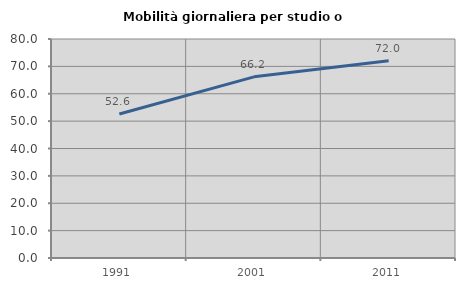
| Category | Mobilità giornaliera per studio o lavoro |
|---|---|
| 1991.0 | 52.604 |
| 2001.0 | 66.183 |
| 2011.0 | 72.039 |